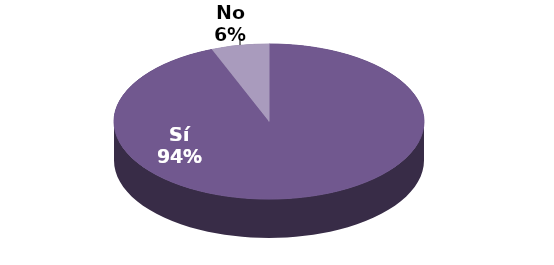
| Category | Series 1 |
|---|---|
| Sí | 141 |
| No | 9 |